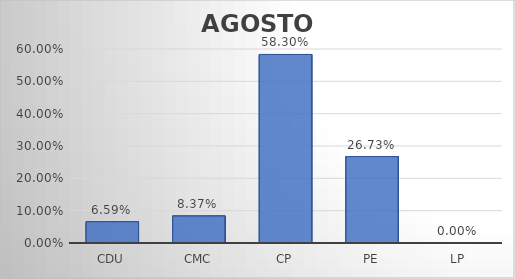
| Category | Series 0 |
|---|---|
| CDU | 0.066 |
| CMC | 0.084 |
| CP | 0.583 |
| PE | 0.267 |
| LP | 0 |